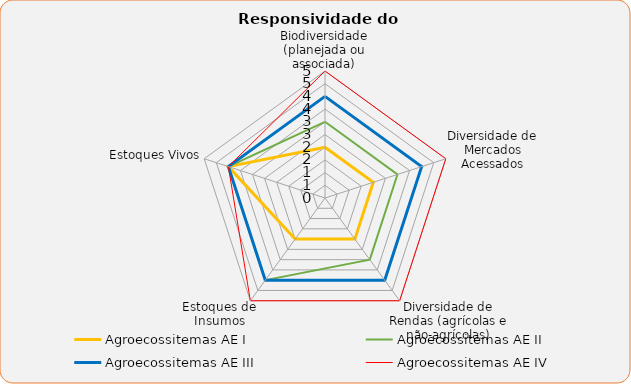
| Category | Agroecossitemas |
|---|---|
| Biodiversidade (planejada ou associada) | 5 |
| Diversidade de Mercados Acessados | 5 |
| Diversidade de Rendas (agrícolas e não-agrícolas) | 5 |
| Estoques de Insumos | 5 |
| Estoques Vivos | 4 |